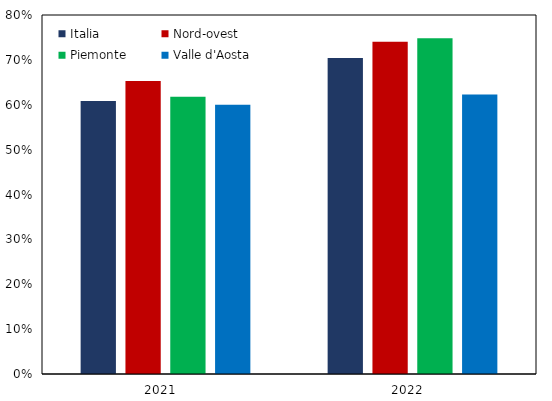
| Category | Italia   | Nord-ovest   | Piemonte   | Valle d'Aosta |
|---|---|---|---|---|
| 2021   | 0.608 | 0.653 | 0.618 | 0.6 |
| 2022   | 0.704 | 0.74 | 0.748 | 0.623 |